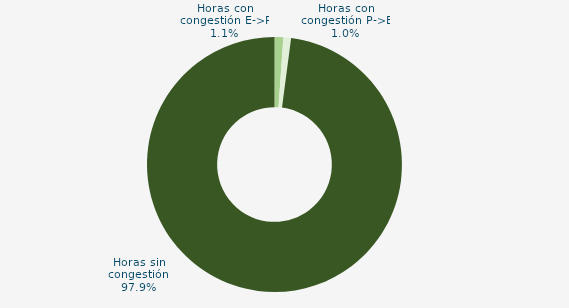
| Category | Horas con congestión E->P |
|---|---|
| Horas con congestión E->P | 1.111 |
| Horas con congestión P->E | 0.972 |
| Horas sin congestión | 97.917 |